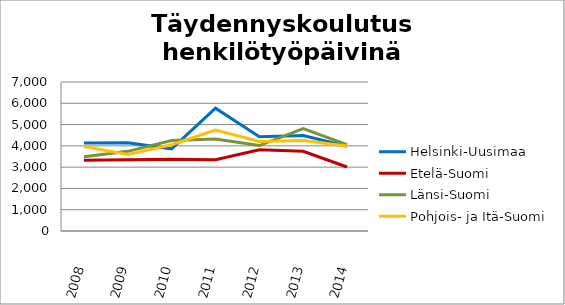
| Category | Helsinki-Uusimaa | Etelä-Suomi | Länsi-Suomi | Pohjois- ja Itä-Suomi |
|---|---|---|---|---|
| 2008.0 | 4130.3 | 3318 | 3484.19 | 3968.9 |
| 2009.0 | 4148.5 | 3347 | 3741.7 | 3600.4 |
| 2010.0 | 3860.5 | 3370.75 | 4254.41 | 4052.08 |
| 2011.0 | 5771.7 | 3345.5 | 4325.5 | 4746 |
| 2012.0 | 4424.3 | 3816.8 | 4014.5 | 4208 |
| 2013.0 | 4490 | 3743 | 4806 | 4253.5 |
| 2014.0 | 3980.4 | 3007.5 | 4057.3 | 3995.5 |